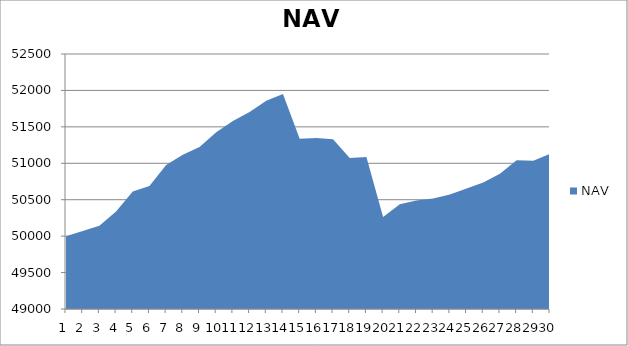
| Category | NAV |
|---|---|
| 0 | 50000 |
| 1 | 50069.444 |
| 2 | 50142.343 |
| 3 | 50336.57 |
| 4 | 50612.255 |
| 5 | 50687.913 |
| 6 | 50975.413 |
| 7 | 51115.874 |
| 8 | 51223.542 |
| 9 | 51427.364 |
| 10 | 51580.567 |
| 11 | 51704.692 |
| 12 | 51858.016 |
| 13 | 51951.766 |
| 14 | 51336.067 |
| 15 | 51345.356 |
| 16 | 51328.667 |
| 17 | 51072.985 |
| 18 | 51085.199 |
| 19 | 50261.67 |
| 20 | 50438.394 |
| 21 | 50489.896 |
| 22 | 50518.251 |
| 23 | 50572.468 |
| 24 | 50655.55 |
| 25 | 50737.787 |
| 26 | 50856.035 |
| 27 | 51041.806 |
| 28 | 51034.925 |
| 29 | 51128.589 |